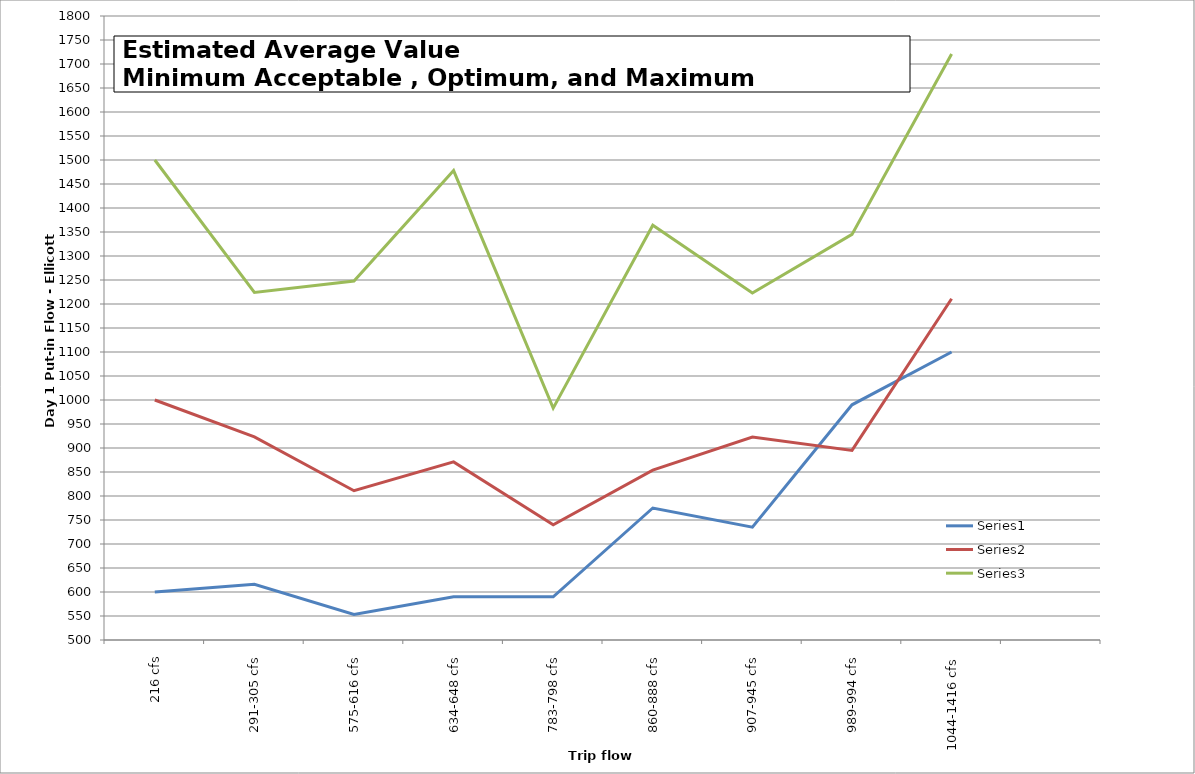
| Category | Series 0 | Series 1 | Series 2 |
|---|---|---|---|
| 216 cfs | 600 | 1000 | 1500 |
| 291-305 cfs | 616 | 923 | 1224 |
| 575-616 cfs | 553 | 811 | 1248 |
| 634-648 cfs | 590 | 871 | 1478 |
| 783-798 cfs | 590 | 740 | 983 |
| 860-888 cfs | 775 | 854 | 1364 |
| 907-945 cfs | 735 | 923 | 1223 |
| 989-994 cfs | 990 | 895 | 1345 |
| 1044-1416 cfs | 1100 | 1211 | 1721 |